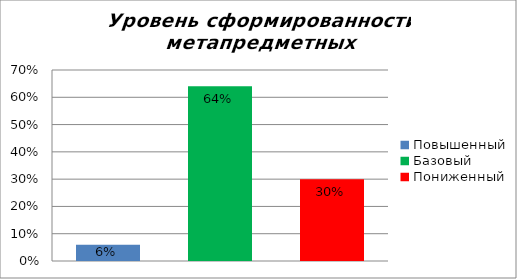
| Category | Уровень сформированности метапредметных результатов |
|---|---|
| Повышенный | 0.06 |
| Базовый | 0.64 |
| Пониженный | 0.3 |